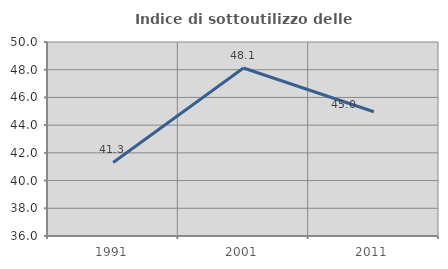
| Category | Indice di sottoutilizzo delle abitazioni  |
|---|---|
| 1991.0 | 41.307 |
| 2001.0 | 48.123 |
| 2011.0 | 44.964 |